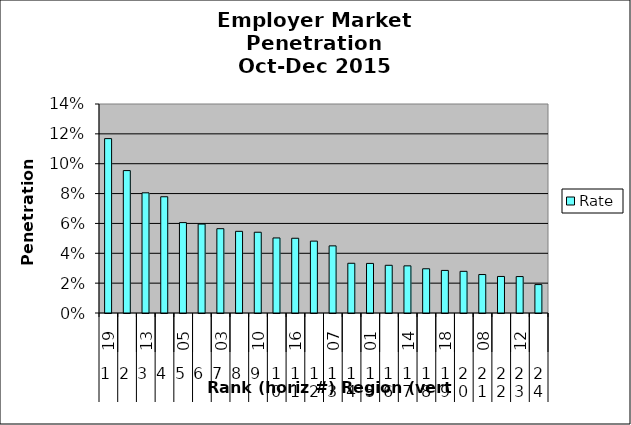
| Category | Rate |
|---|---|
| 0 | 0.117 |
| 1 | 0.095 |
| 2 | 0.081 |
| 3 | 0.078 |
| 4 | 0.061 |
| 5 | 0.06 |
| 6 | 0.056 |
| 7 | 0.055 |
| 8 | 0.054 |
| 9 | 0.05 |
| 10 | 0.05 |
| 11 | 0.048 |
| 12 | 0.045 |
| 13 | 0.033 |
| 14 | 0.033 |
| 15 | 0.032 |
| 16 | 0.032 |
| 17 | 0.03 |
| 18 | 0.029 |
| 19 | 0.028 |
| 20 | 0.026 |
| 21 | 0.024 |
| 22 | 0.024 |
| 23 | 0.019 |